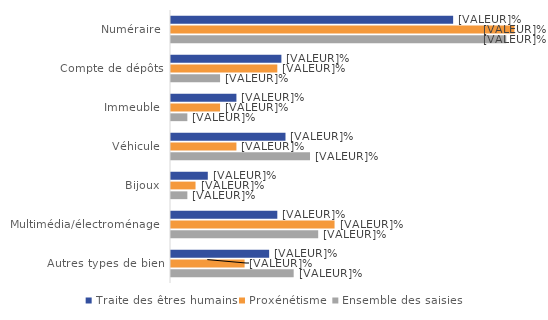
| Category | Traite des êtres humains | Proxénétisme | Ensemble des saisies |
|---|---|---|---|
| Numéraire | 34.5 | 42 | 41 |
| Compte de dépôts | 13.5 | 13 | 6 |
| Immeuble | 8 | 6 | 2 |
| Véhicule | 14 | 8 | 17 |
| Bijoux | 4.5 | 3 | 2 |
| Multimédia/électroménager | 13 | 20 | 18 |
| Autres types de bien | 12 | 9 | 15 |